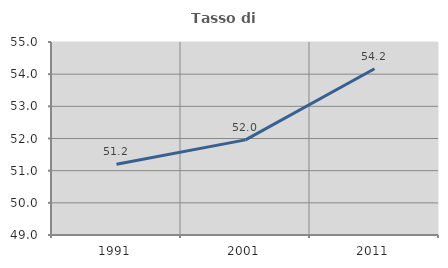
| Category | Tasso di occupazione   |
|---|---|
| 1991.0 | 51.199 |
| 2001.0 | 51.957 |
| 2011.0 | 54.168 |